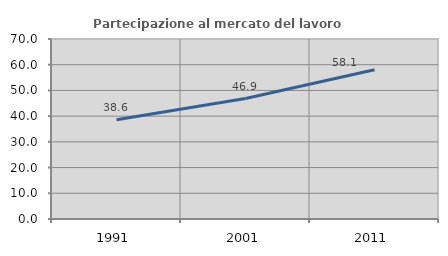
| Category | Partecipazione al mercato del lavoro  femminile |
|---|---|
| 1991.0 | 38.604 |
| 2001.0 | 46.852 |
| 2011.0 | 58.055 |